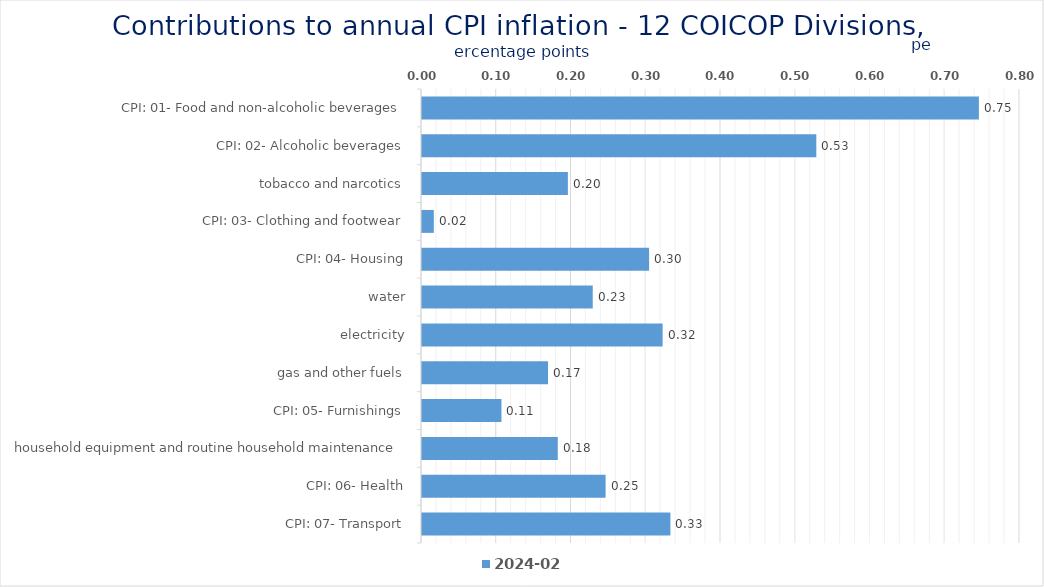
| Category | 2024-02 |
|---|---|
| CPI: 01- Food and non-alcoholic beverages | 0.745 |
| CPI: 02- Alcoholic beverages, tobacco and narcotics | 0.528 |
| CPI: 03- Clothing and footwear | 0.195 |
| CPI: 04- Housing, water, electricity, gas and other fuels | 0.016 |
| CPI: 05- Furnishings, household equipment and routine household maintenance | 0.304 |
| CPI: 06- Health | 0.228 |
| CPI: 07- Transport | 0.322 |
| CPI: 08- Communication | 0.169 |
| CPI: 09- Recreation and culture | 0.106 |
| CPI: 10- Education | 0.182 |
| CPI: 11- Restaurants and hotels | 0.246 |
| CPI: 12- Miscellaneous goods and services | 0.332 |